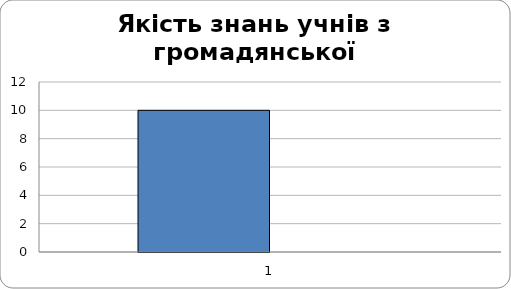
| Category | Series 0 | Series 1 |
|---|---|---|
| 0 | 10 |  |